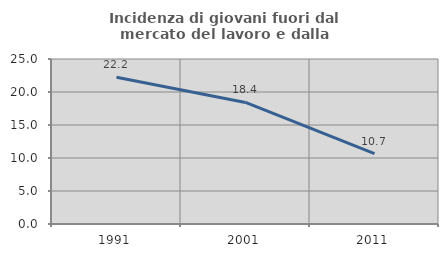
| Category | Incidenza di giovani fuori dal mercato del lavoro e dalla formazione  |
|---|---|
| 1991.0 | 22.222 |
| 2001.0 | 18.421 |
| 2011.0 | 10.667 |